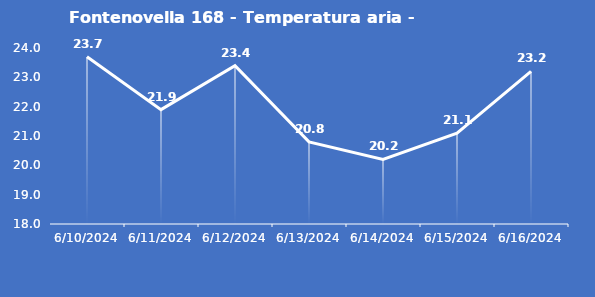
| Category | Fontenovella 168 - Temperatura aria - Grezzo (°C) |
|---|---|
| 6/10/24 | 23.7 |
| 6/11/24 | 21.9 |
| 6/12/24 | 23.4 |
| 6/13/24 | 20.8 |
| 6/14/24 | 20.2 |
| 6/15/24 | 21.1 |
| 6/16/24 | 23.2 |